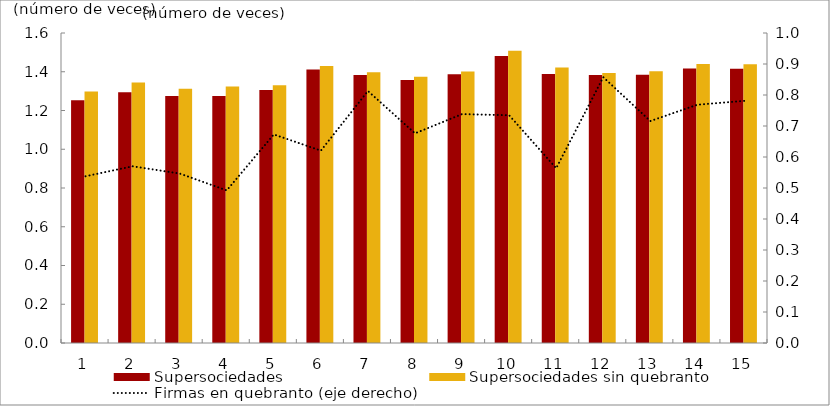
| Category | Supersociedades | Supersociedades sin quebranto |
|---|---|---|
| 0 | 1.253 | 1.298 |
| 1 | 1.294 | 1.344 |
| 2 | 1.275 | 1.312 |
| 3 | 1.275 | 1.324 |
| 4 | 1.306 | 1.331 |
| 5 | 1.411 | 1.43 |
| 6 | 1.383 | 1.397 |
| 7 | 1.357 | 1.374 |
| 8 | 1.387 | 1.401 |
| 9 | 1.481 | 1.508 |
| 10 | 1.388 | 1.422 |
| 11 | 1.383 | 1.393 |
| 12 | 1.384 | 1.402 |
| 13 | 1.416 | 1.44 |
| 14 | 1.416 | 1.438 |